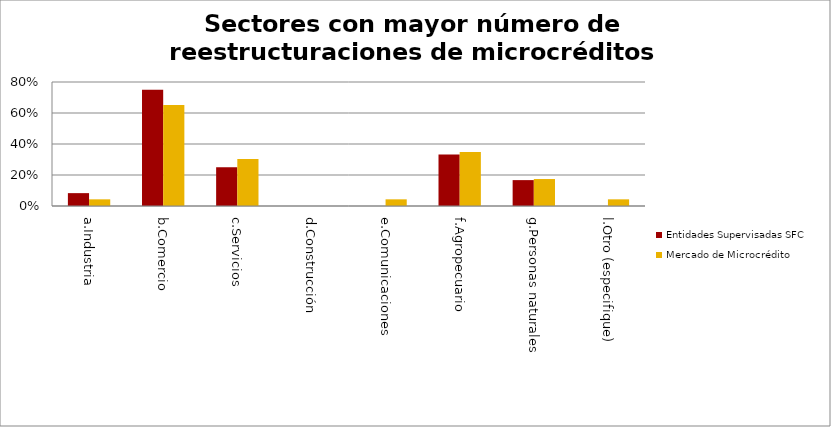
| Category | Entidades Supervisadas SFC | Mercado de Microcrédito |
|---|---|---|
| a.Industria | 0.083 | 0.043 |
| b.Comercio | 0.75 | 0.652 |
| c.Servicios | 0.25 | 0.304 |
| d.Construcción | 0 | 0 |
| e.Comunicaciones | 0 | 0.043 |
| f.Agropecuario | 0.333 | 0.348 |
| g.Personas naturales | 0.167 | 0.174 |
| l.Otro (especifique) | 0 | 0.043 |